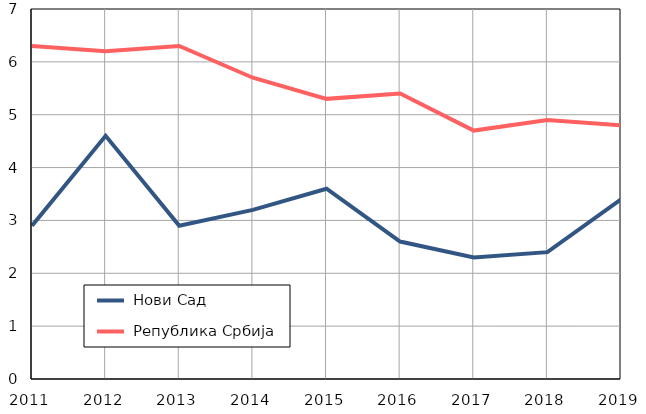
| Category |  Нови Сад |  Република Србија |
|---|---|---|
| 2011.0 | 2.9 | 6.3 |
| 2012.0 | 4.6 | 6.2 |
| 2013.0 | 2.9 | 6.3 |
| 2014.0 | 3.2 | 5.7 |
| 2015.0 | 3.6 | 5.3 |
| 2016.0 | 2.6 | 5.4 |
| 2017.0 | 2.3 | 4.7 |
| 2018.0 | 2.4 | 4.9 |
| 2019.0 | 3.4 | 4.8 |